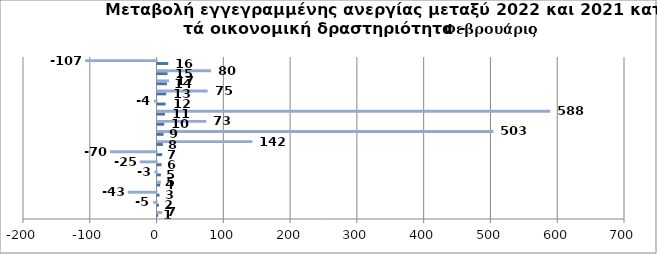
| Category | Series 0 | Series 1 |
|---|---|---|
| 0 | 1 | 7 |
| 1 | 2 | -5 |
| 2 | 3 | -43 |
| 3 | 4 | 5 |
| 4 | 5 | -3 |
| 5 | 6 | -25 |
| 6 | 7 | -70 |
| 7 | 8 | 142 |
| 8 | 9 | 503 |
| 9 | 10 | 73 |
| 10 | 11 | 588 |
| 11 | 12 | -4 |
| 12 | 13 | 75 |
| 13 | 14 | 17 |
| 14 | 15 | 80 |
| 15 | 16 | -107 |